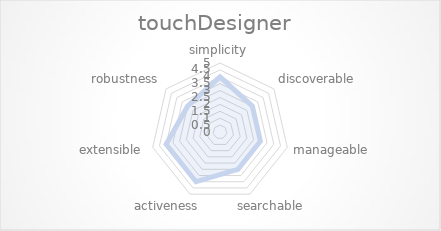
| Category | touchDesigner |
|---|---|
| simplicity | 4 |
| discoverable | 3 |
| manageable | 3 |
| searchable | 3 |
| activeness | 4 |
| extensible | 4 |
| robustness | 3 |